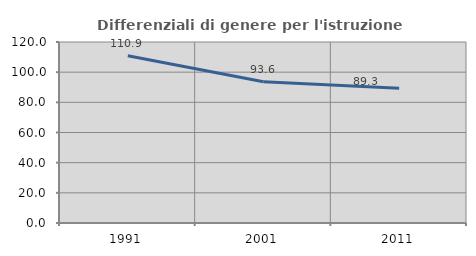
| Category | Differenziali di genere per l'istruzione superiore |
|---|---|
| 1991.0 | 110.904 |
| 2001.0 | 93.633 |
| 2011.0 | 89.257 |